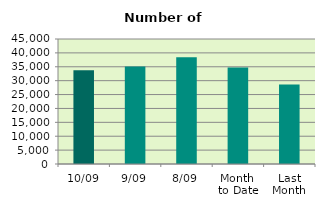
| Category | Series 0 |
|---|---|
| 10/09 | 33786 |
| 9/09 | 35126 |
| 8/09 | 38386 |
| Month 
to Date | 34710.5 |
| Last
Month | 28637.636 |